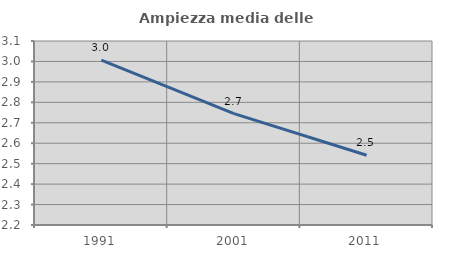
| Category | Ampiezza media delle famiglie |
|---|---|
| 1991.0 | 3.007 |
| 2001.0 | 2.745 |
| 2011.0 | 2.541 |